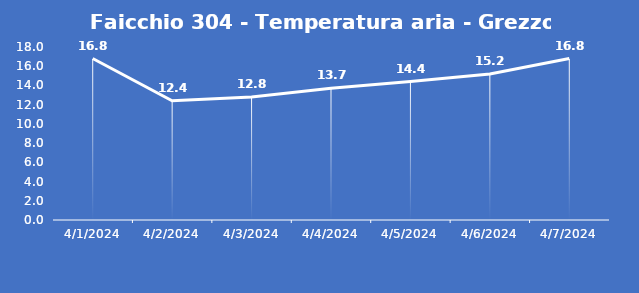
| Category | Faicchio 304 - Temperatura aria - Grezzo (°C) |
|---|---|
| 4/1/24 | 16.8 |
| 4/2/24 | 12.4 |
| 4/3/24 | 12.8 |
| 4/4/24 | 13.7 |
| 4/5/24 | 14.4 |
| 4/6/24 | 15.2 |
| 4/7/24 | 16.8 |